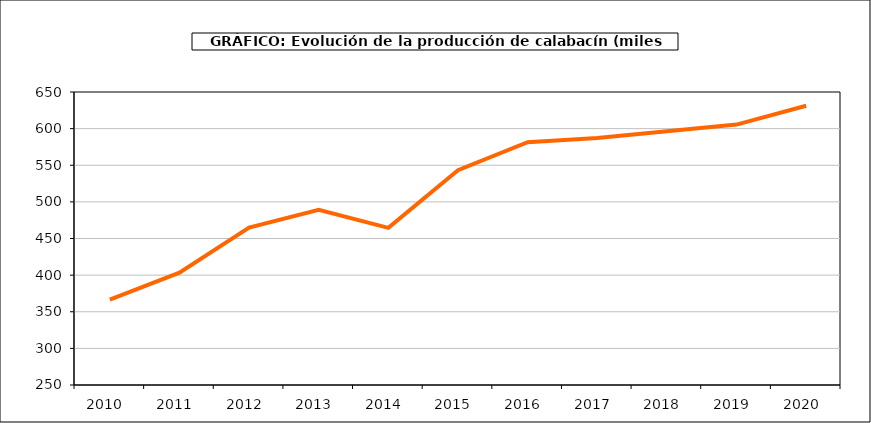
| Category | producción |
|---|---|
| 2010.0 | 366.498 |
| 2011.0 | 403.38 |
| 2012.0 | 465.039 |
| 2013.0 | 489.297 |
| 2014.0 | 464.496 |
| 2015.0 | 543.195 |
| 2016.0 | 581.503 |
| 2017.0 | 587.174 |
| 2018.0 | 596.315 |
| 2019.0 | 605.527 |
| 2020.0 | 631.244 |